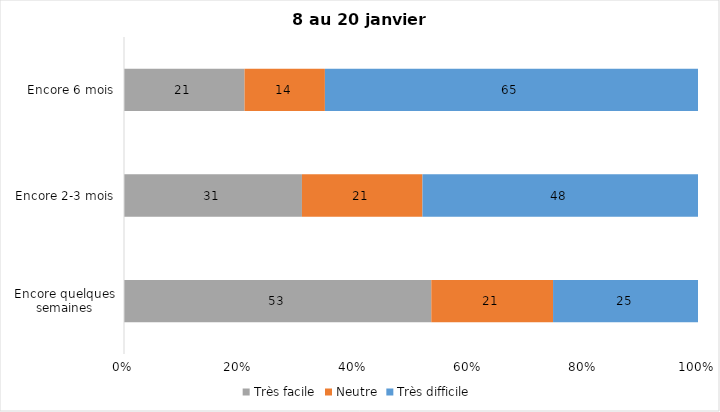
| Category | Très facile | Neutre | Très difficile |
|---|---|---|---|
| Encore quelques semaines | 53 | 21 | 25 |
| Encore 2-3 mois | 31 | 21 | 48 |
| Encore 6 mois | 21 | 14 | 65 |